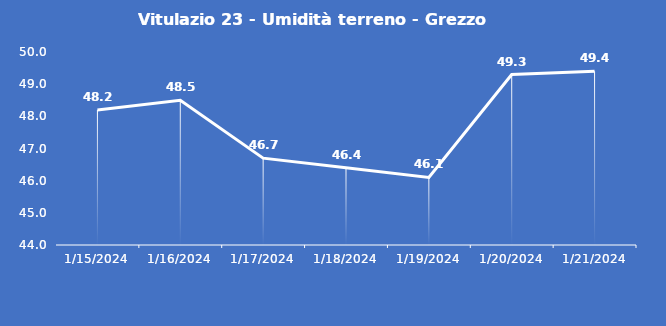
| Category | Vitulazio 23 - Umidità terreno - Grezzo (%VWC) |
|---|---|
| 1/15/24 | 48.2 |
| 1/16/24 | 48.5 |
| 1/17/24 | 46.7 |
| 1/18/24 | 46.4 |
| 1/19/24 | 46.1 |
| 1/20/24 | 49.3 |
| 1/21/24 | 49.4 |